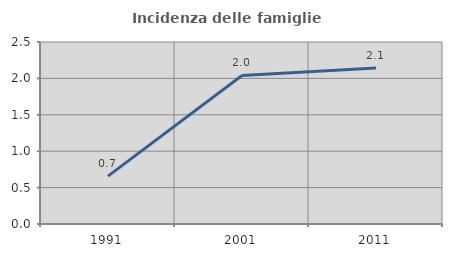
| Category | Incidenza delle famiglie numerose |
|---|---|
| 1991.0 | 0.658 |
| 2001.0 | 2.041 |
| 2011.0 | 2.143 |